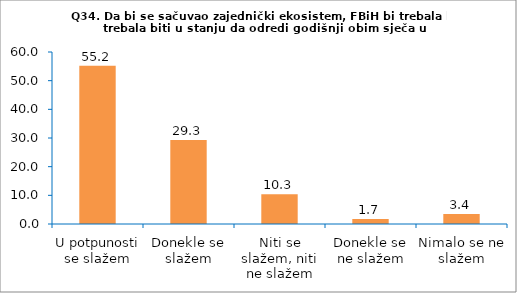
| Category | Series 0 |
|---|---|
| U potpunosti se slažem | 55.172 |
| Donekle se slažem | 29.31 |
| Niti se slažem, niti ne slažem | 10.345 |
| Donekle se ne slažem | 1.724 |
| Nimalo se ne slažem | 3.448 |